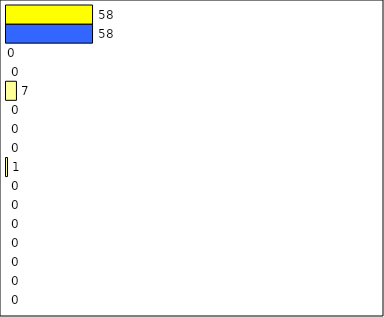
| Category | -2 | -1 | 0 | 1 | 2 | 3 | 4 | 5 | 6 | 7 | 8 | 9 | 10 | 11 | 12 | Perfect Round |
|---|---|---|---|---|---|---|---|---|---|---|---|---|---|---|---|---|
| 0 | 0 | 0 | 0 | 0 | 0 | 0 | 0 | 1 | 0 | 0 | 0 | 7 | 0 | 0 | 58 | 58 |